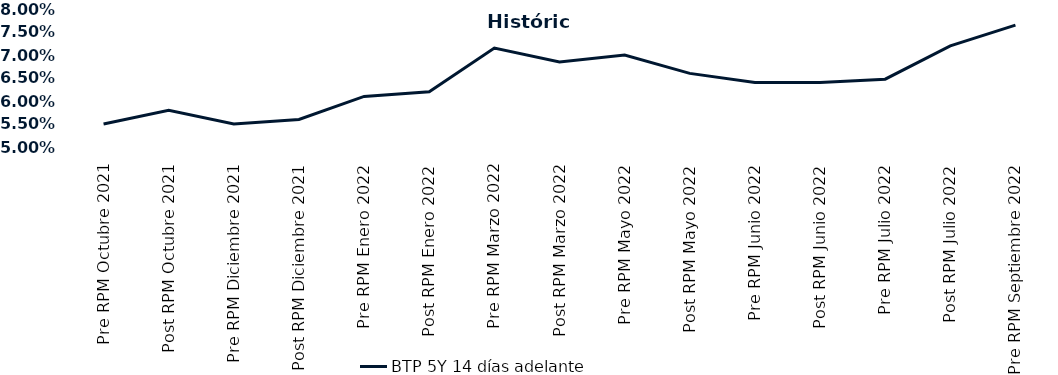
| Category | BTP 5Y 14 días adelante |
|---|---|
| Pre RPM Octubre 2021 | 0.055 |
| Post RPM Octubre 2021 | 0.058 |
| Pre RPM Diciembre 2021 | 0.055 |
| Post RPM Diciembre 2021 | 0.056 |
| Pre RPM Enero 2022 | 0.061 |
| Post RPM Enero 2022 | 0.062 |
| Pre RPM Marzo 2022 | 0.072 |
| Post RPM Marzo 2022 | 0.068 |
| Pre RPM Mayo 2022 | 0.07 |
| Post RPM Mayo 2022 | 0.066 |
| Pre RPM Junio 2022 | 0.064 |
| Post RPM Junio 2022 | 0.064 |
| Pre RPM Julio 2022 | 0.065 |
| Post RPM Julio 2022 | 0.072 |
| Pre RPM Septiembre 2022 | 0.076 |